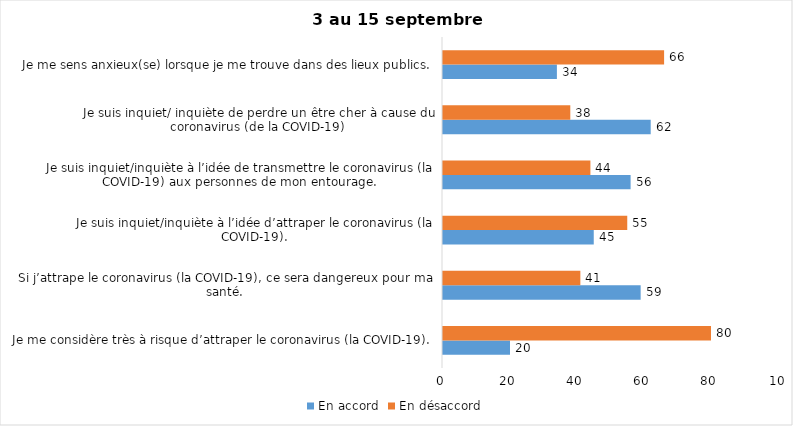
| Category | En accord | En désaccord |
|---|---|---|
| Je me considère très à risque d’attraper le coronavirus (la COVID-19). | 20 | 80 |
| Si j’attrape le coronavirus (la COVID-19), ce sera dangereux pour ma santé. | 59 | 41 |
| Je suis inquiet/inquiète à l’idée d’attraper le coronavirus (la COVID-19). | 45 | 55 |
| Je suis inquiet/inquiète à l’idée de transmettre le coronavirus (la COVID-19) aux personnes de mon entourage. | 56 | 44 |
| Je suis inquiet/ inquiète de perdre un être cher à cause du coronavirus (de la COVID-19) | 62 | 38 |
| Je me sens anxieux(se) lorsque je me trouve dans des lieux publics. | 34 | 66 |